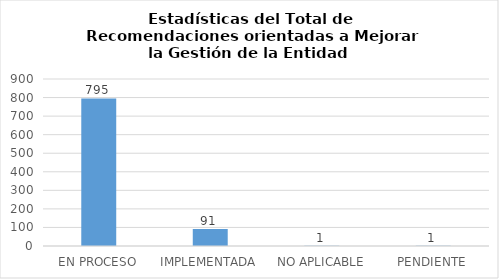
| Category | Series 0 |
|---|---|
| EN PROCESO | 795 |
| IMPLEMENTADA | 91 |
| NO APLICABLE | 1 |
| PENDIENTE | 1 |